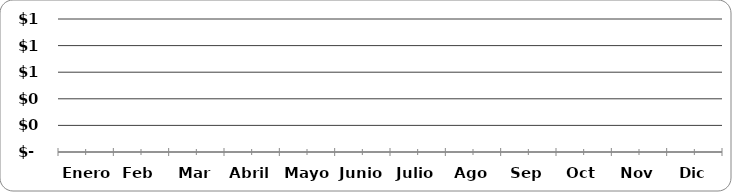
| Category | Series 0 |
|---|---|
| Enero | 0 |
| Feb | 0 |
| Mar | 0 |
| Abril | 0 |
| Mayo | 0 |
| Junio | 0 |
| Julio | 0 |
| Ago | 0 |
| Sep | 0 |
| Oct | 0 |
| Nov | 0 |
| Dic | 0 |